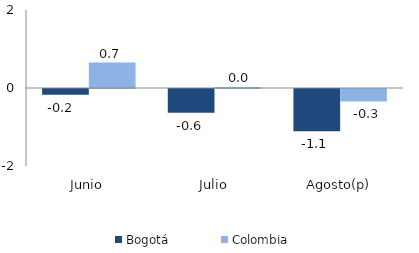
| Category | Bogotá | Colombia |
|---|---|---|
| Junio | -0.15 | 0.652 |
| Julio | -0.609 | 0.024 |
| Agosto(p) | -1.082 | -0.318 |